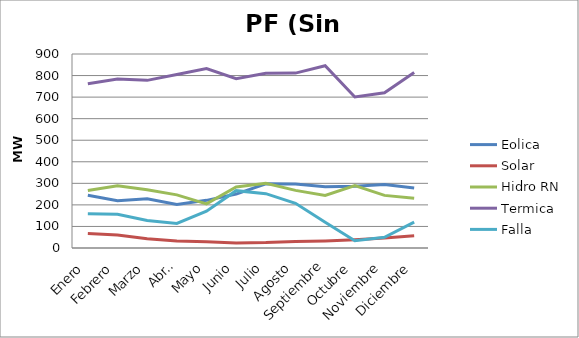
| Category | Eolica | Solar | Hidro RN | Termica | Falla |
|---|---|---|---|---|---|
| Enero | 245.015 | 66.989 | 267.105 | 762.025 | 158.798 |
| Febrero | 219.502 | 60.587 | 288.277 | 783.711 | 156.878 |
| Marzo | 228.766 | 42.644 | 269.802 | 777.75 | 127.821 |
| Abril | 201.382 | 32.849 | 246.616 | 804.958 | 114.159 |
| Mayo | 221.074 | 29.558 | 204.721 | 832.388 | 170.86 |
| Junio | 250.137 | 23.736 | 282.723 | 785.633 | 265.977 |
| Julio | 298.145 | 25.087 | 300.449 | 810.985 | 252.216 |
| Agosto | 296.623 | 30.266 | 267.218 | 811.378 | 207.424 |
| Septiembre | 284.173 | 32.84 | 243.51 | 845.638 | 119.342 |
| Octubre | 286.323 | 38.289 | 289.184 | 700.402 | 33.865 |
| Noviembre | 294.112 | 46.704 | 244.045 | 719.91 | 49.914 |
| Diciembre | 278.271 | 57.262 | 230.515 | 814.239 | 119.706 |